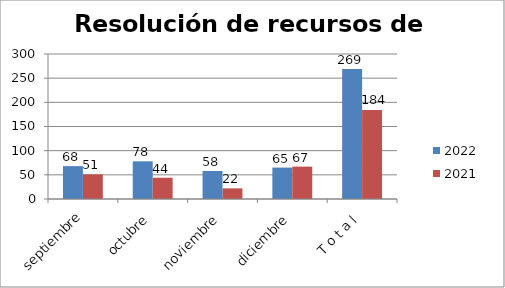
| Category | 2022 | 2021 |
|---|---|---|
| septiembre | 68 | 51 |
| octubre | 78 | 44 |
| noviembre | 58 | 22 |
| diciembre | 65 | 67 |
| T o t a l | 269 | 184 |